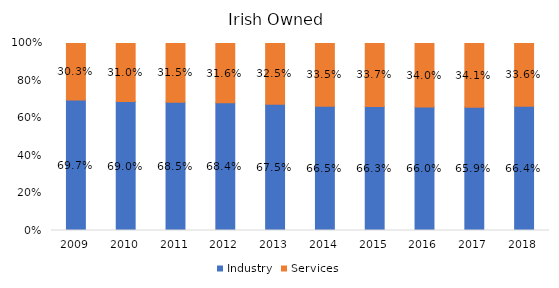
| Category | Industry | Services |
|---|---|---|
| 2009.0 | 0.697 | 0.303 |
| 2010.0 | 0.69 | 0.31 |
| 2011.0 | 0.685 | 0.315 |
| 2012.0 | 0.684 | 0.316 |
| 2013.0 | 0.675 | 0.325 |
| 2014.0 | 0.665 | 0.335 |
| 2015.0 | 0.663 | 0.337 |
| 2016.0 | 0.66 | 0.34 |
| 2017.0 | 0.659 | 0.341 |
| 2018.0 | 0.664 | 0.336 |